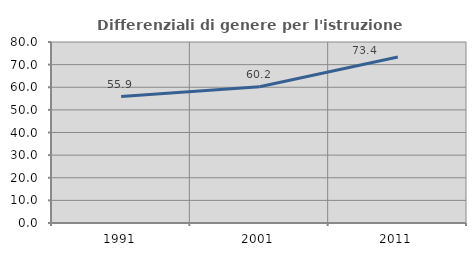
| Category | Differenziali di genere per l'istruzione superiore |
|---|---|
| 1991.0 | 55.905 |
| 2001.0 | 60.237 |
| 2011.0 | 73.369 |